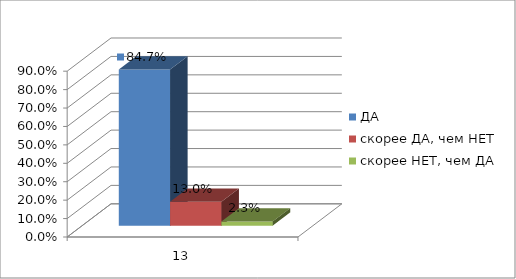
| Category | ДА | скорее ДА, чем НЕТ | скорее НЕТ, чем ДА |
|---|---|---|---|
| 0 | 0.847 | 0.13 | 0.023 |